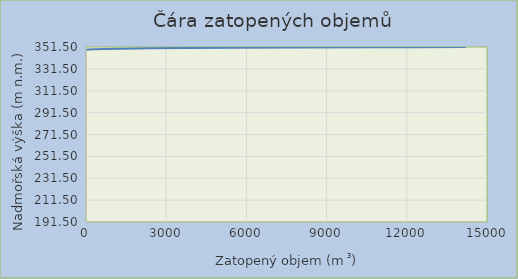
| Category | Total volume |
|---|---|
| 0.46994400000001785 | 348.5 |
| 8.108544000000018 | 348.75 |
| 30.999994000000015 | 349 |
| 104.95171900000001 | 349.25 |
| 301.332194 | 349.5 |
| 680.928044 | 349.75 |
| 1342.335644 | 350 |
| 2387.783244 | 350.25 |
| 3819.725844 | 350.5 |
| 5626.2646939999995 | 350.75 |
| 7936.912294 | 351 |
| 10898.671144 | 351.25 |
| 14210.509244 | 351.5 |